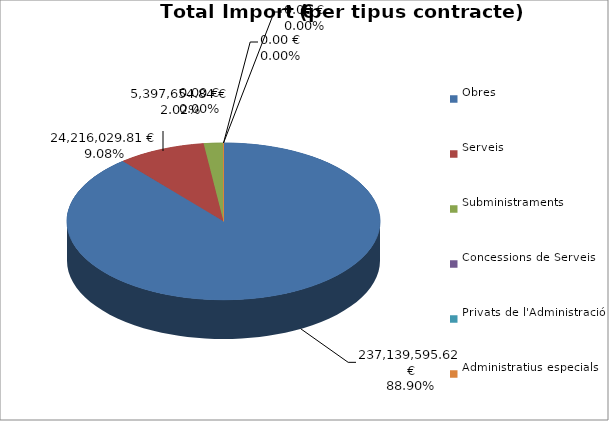
| Category | Total preu
(amb IVA) |
|---|---|
| Obres | 237139595.62 |
| Serveis | 24216029.81 |
| Subministraments | 5397654.84 |
| Concessions de Serveis | 0 |
| Privats de l'Administració | 0 |
| Administratius especials | 0 |